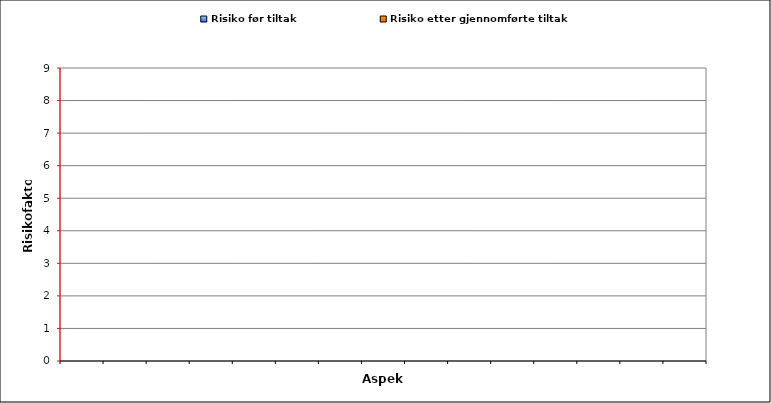
| Category | Risiko før tiltak | Risiko etter gjennomførte tiltak |
|---|---|---|
|  | 0 |  |
|  | 0 |  |
|  | 0 |  |
|  | 0 |  |
|  | 0 |  |
|  | 0 |  |
|  | 0 |  |
|  | 0 |  |
|  | 0 |  |
|  | 0 |  |
|  | 0 |  |
|  | 0 |  |
|  | 0 |  |
|  | 0 |  |
|  | 0 |  |